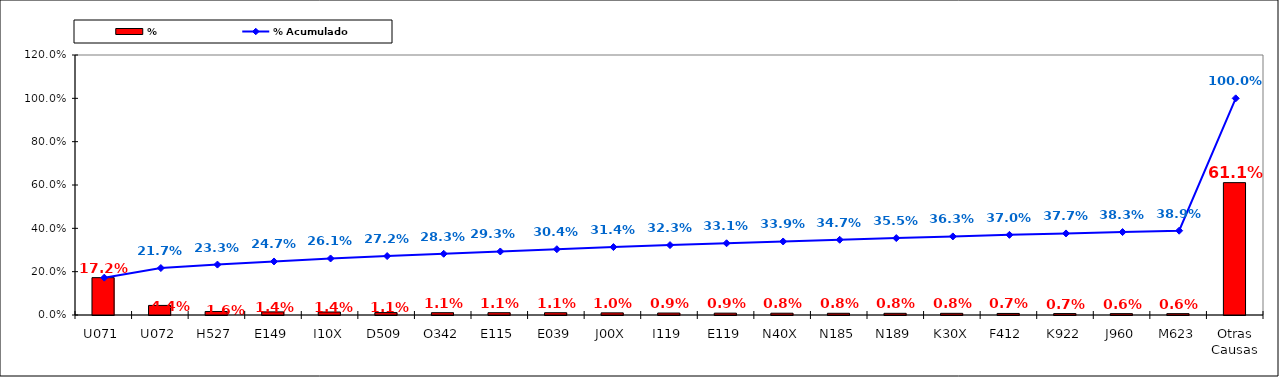
| Category | % |
|---|---|
| U071 | 0.172 |
| U072 | 0.044 |
| H527 | 0.016 |
| E149 | 0.014 |
| I10X | 0.014 |
| D509 | 0.011 |
| O342 | 0.011 |
| E115 | 0.011 |
| E039 | 0.011 |
| J00X | 0.01 |
| I119 | 0.009 |
| E119 | 0.009 |
| N40X | 0.008 |
| N185 | 0.008 |
| N189 | 0.008 |
| K30X | 0.008 |
| F412 | 0.007 |
| K922 | 0.007 |
| J960 | 0.006 |
| M623 | 0.006 |
| Otras Causas | 0.611 |